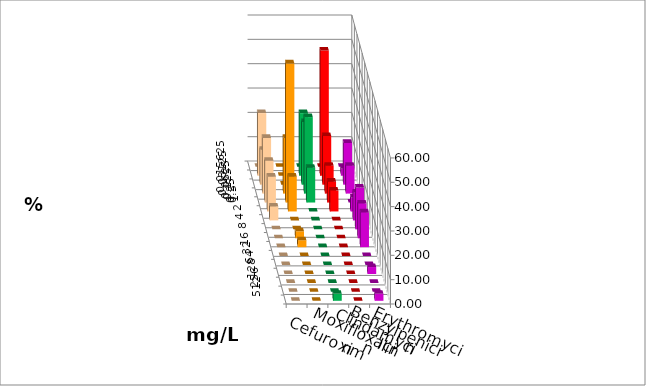
| Category | Cefuroxim | Moxifloxacin | Clindamycin | Benzylpenicillin | Erythromycin |
|---|---|---|---|---|---|
| 0.015625 | 0 | 0 | 0 | 0 | 0 |
| 0.03125 | 25.714 | 0 | 25.714 | 51.429 | 2.857 |
| 0.0625 | 14.286 | 0 | 25.714 | 20 | 17.143 |
| 0.125 | 22.857 | 22.857 | 31.429 | 11.429 | 11.429 |
| 0.25 | 17.143 | 57.143 | 14.286 | 8.571 | 0 |
| 0.5 | 14.286 | 14.286 | 0 | 8.571 | 5.714 |
| 1.0 | 5.714 | 0 | 0 | 0 | 11.429 |
| 2.0 | 0 | 0 | 0 | 0 | 17.143 |
| 4.0 | 0 | 2.857 | 0 | 0 | 14.286 |
| 8.0 | 0 | 2.857 | 0 | 0 | 14.286 |
| 16.0 | 0 | 0 | 0 | 0 | 0 |
| 32.0 | 0 | 0 | 0 | 0 | 0 |
| 64.0 | 0 | 0 | 0 | 0 | 2.857 |
| 128.0 | 0 | 0 | 0 | 0 | 0 |
| 256.0 | 0 | 0 | 0 | 0 | 0 |
| 512.0 | 0 | 0 | 2.857 | 0 | 2.857 |